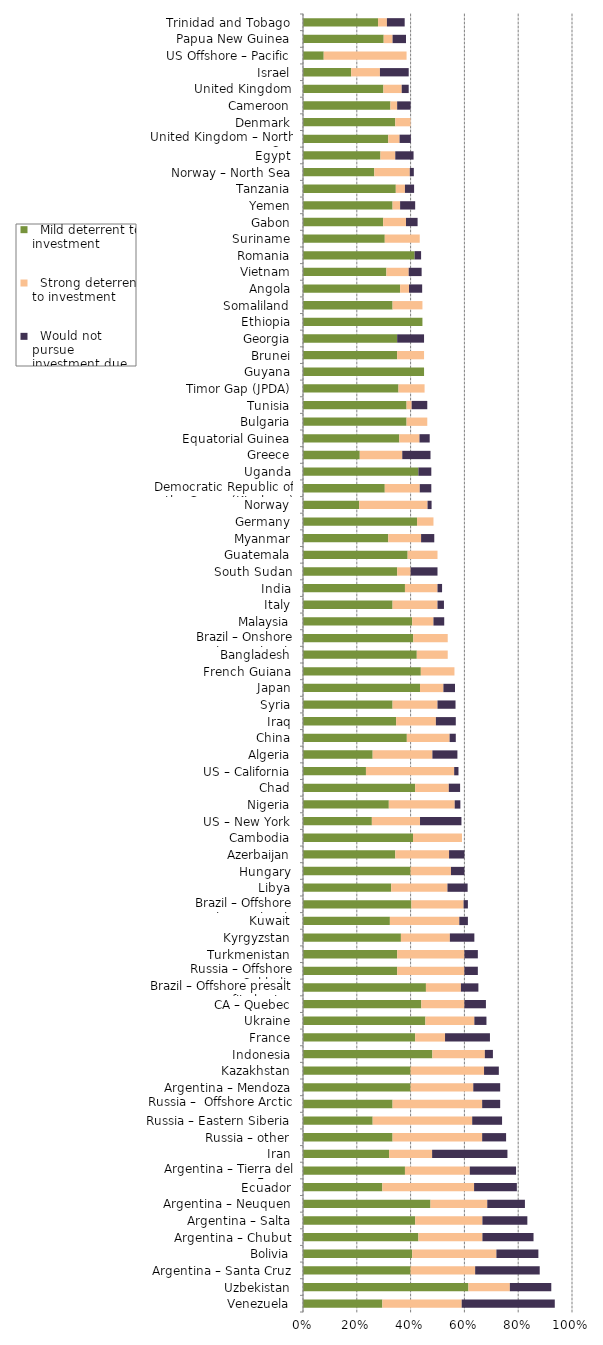
| Category |   Mild deterrent to investment |   Strong deterrent to investment |   Would not pursue investment due to this factor |
|---|---|---|---|
| Venezuela | 0.295 | 0.295 | 0.346 |
| Uzbekistan | 0.615 | 0.154 | 0.154 |
| Argentina – Santa Cruz | 0.4 | 0.24 | 0.24 |
| Bolivia | 0.406 | 0.313 | 0.156 |
| Argentina – Chubut | 0.429 | 0.238 | 0.19 |
| Argentina – Salta | 0.417 | 0.25 | 0.167 |
| Argentina – Neuquen | 0.474 | 0.211 | 0.14 |
| Ecuador | 0.295 | 0.341 | 0.159 |
| Argentina – Tierra del Fuego | 0.379 | 0.241 | 0.172 |
| Iran | 0.32 | 0.16 | 0.28 |
| Russia – other | 0.333 | 0.333 | 0.089 |
| Russia – Eastern Siberia | 0.259 | 0.37 | 0.111 |
| Russia –  Offshore Arctic | 0.333 | 0.333 | 0.067 |
| Argentina – Mendoza | 0.4 | 0.233 | 0.1 |
| Kazakhstan | 0.4 | 0.273 | 0.055 |
| Indonesia | 0.481 | 0.195 | 0.03 |
| France | 0.417 | 0.111 | 0.167 |
| Ukraine | 0.455 | 0.182 | 0.045 |
| CA – Quebec | 0.44 | 0.16 | 0.08 |
| Brazil – Offshore presalt area profit sharing contracts | 0.457 | 0.13 | 0.065 |
| Russia – Offshore Sakhalin | 0.35 | 0.25 | 0.05 |
| Turkmenistan | 0.35 | 0.25 | 0.05 |
| Kyrgyzstan | 0.364 | 0.182 | 0.091 |
| Kuwait | 0.323 | 0.258 | 0.032 |
| Brazil – Offshore concession contracts | 0.403 | 0.194 | 0.016 |
| Libya | 0.328 | 0.209 | 0.075 |
| Hungary | 0.4 | 0.15 | 0.05 |
| Azerbaijan | 0.343 | 0.2 | 0.057 |
| Cambodia | 0.409 | 0.182 | 0 |
| US – New York | 0.256 | 0.179 | 0.154 |
| Nigeria | 0.319 | 0.245 | 0.021 |
| Chad | 0.417 | 0.125 | 0.042 |
| US – California | 0.234 | 0.328 | 0.016 |
| Algeria | 0.259 | 0.222 | 0.093 |
| China | 0.386 | 0.159 | 0.023 |
| Iraq | 0.346 | 0.148 | 0.074 |
| Syria | 0.333 | 0.167 | 0.067 |
| Japan | 0.435 | 0.087 | 0.043 |
| French Guiana | 0.438 | 0.125 | 0 |
| Bangladesh | 0.423 | 0.115 | 0 |
| Brazil – Onshore concession contracts | 0.41 | 0.128 | 0 |
| Malaysia | 0.406 | 0.079 | 0.04 |
| Italy | 0.333 | 0.167 | 0.024 |
| India | 0.379 | 0.121 | 0.017 |
| South Sudan | 0.35 | 0.05 | 0.1 |
| Guatemala | 0.389 | 0.111 | 0 |
| Myanmar | 0.317 | 0.122 | 0.049 |
| Germany | 0.424 | 0.061 | 0 |
| Norway | 0.209 | 0.254 | 0.015 |
| Democratic Republic of the Congo (Kinshasa) | 0.304 | 0.13 | 0.043 |
| Uganda | 0.429 | 0 | 0.048 |
| Greece | 0.211 | 0.158 | 0.105 |
| Equatorial Guinea | 0.358 | 0.075 | 0.038 |
| Bulgaria | 0.385 | 0.077 | 0 |
| Tunisia | 0.385 | 0.019 | 0.058 |
| Timor Gap (JPDA) | 0.355 | 0.097 | 0 |
| Guyana | 0.45 | 0 | 0 |
| Brunei | 0.35 | 0.1 | 0 |
| Georgia | 0.35 | 0 | 0.1 |
| Ethiopia | 0.444 | 0 | 0 |
| Somaliland | 0.333 | 0.111 | 0 |
| Angola | 0.361 | 0.033 | 0.049 |
| Vietnam | 0.31 | 0.083 | 0.048 |
| Romania | 0.415 | 0 | 0.024 |
| Suriname | 0.304 | 0.13 | 0 |
| Gabon | 0.298 | 0.085 | 0.043 |
| Yemen | 0.333 | 0.028 | 0.056 |
| Tanzania | 0.345 | 0.034 | 0.034 |
| Norway – North Sea | 0.265 | 0.132 | 0.015 |
| Egypt | 0.288 | 0.055 | 0.068 |
| United Kingdom – North Sea | 0.317 | 0.042 | 0.042 |
| Denmark | 0.343 | 0.057 | 0 |
| Cameroon | 0.325 | 0.025 | 0.05 |
| United Kingdom | 0.299 | 0.068 | 0.026 |
| Israel | 0.179 | 0.107 | 0.107 |
| US Offshore – Pacific | 0.077 | 0.308 | 0 |
| Papua New Guinea | 0.3 | 0.033 | 0.05 |
| Trinidad and Tobago | 0.279 | 0.033 | 0.066 |